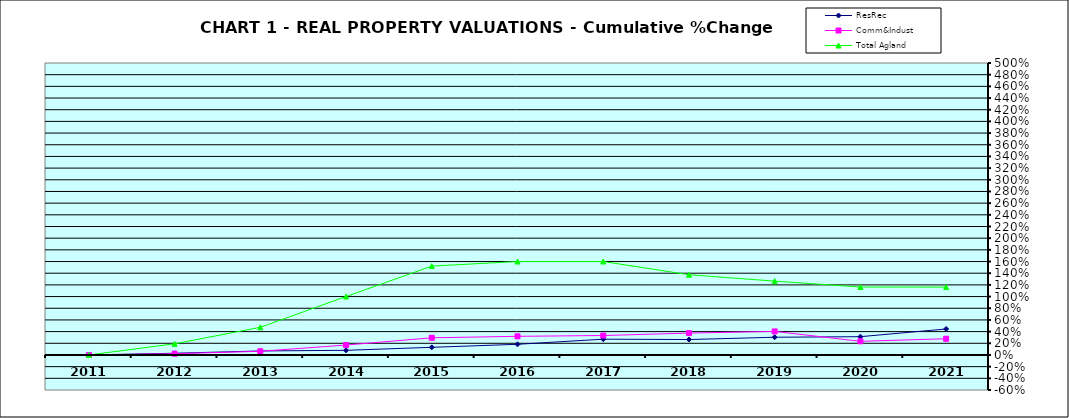
| Category | ResRec | Comm&Indust | Total Agland |
|---|---|---|---|
| 2011.0 | 0 | 0 | 0 |
| 2012.0 | 0.029 | 0.021 | 0.191 |
| 2013.0 | 0.069 | 0.063 | 0.474 |
| 2014.0 | 0.079 | 0.17 | 1 |
| 2015.0 | 0.131 | 0.294 | 1.522 |
| 2016.0 | 0.183 | 0.319 | 1.6 |
| 2017.0 | 0.27 | 0.333 | 1.6 |
| 2018.0 | 0.264 | 0.375 | 1.374 |
| 2019.0 | 0.304 | 0.403 | 1.264 |
| 2020.0 | 0.313 | 0.234 | 1.164 |
| 2021.0 | 0.445 | 0.278 | 1.162 |